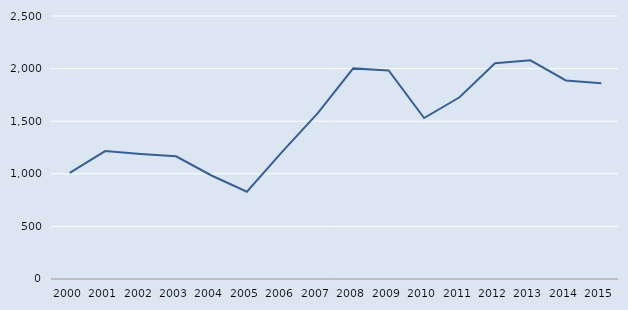
| Category | Series 0 |
|---|---|
| 2000.0 | 1009 |
| 2001.0 | 1216 |
| 2002.0 | 1189 |
| 2003.0 | 1166 |
| 2004.0 | 984 |
| 2005.0 | 830 |
| 2006.0 | 1211 |
| 2007.0 | 1577 |
| 2008.0 | 2002 |
| 2009.0 | 1983 |
| 2010.0 | 1530 |
| 2011.0 | 1727 |
| 2012.0 | 2051 |
| 2013.0 | 2079 |
| 2014.0 | 1887 |
| 2015.0 | 1860 |